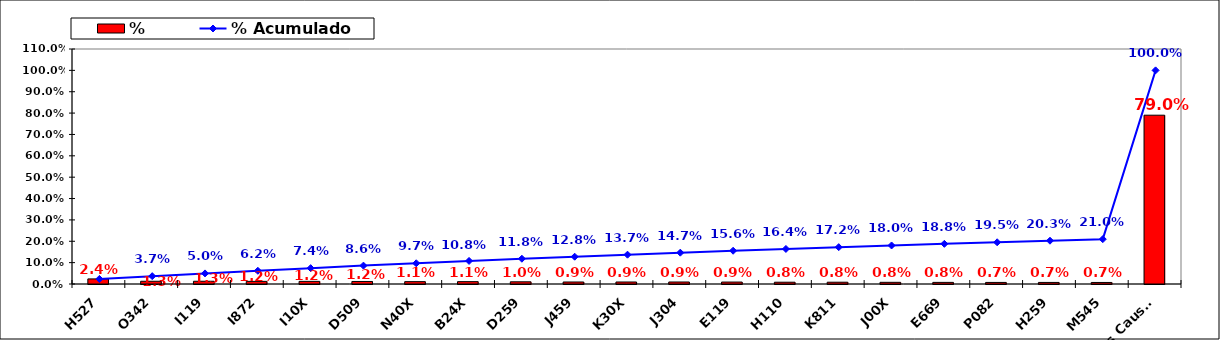
| Category | % |
|---|---|
| H527 | 0.024 |
| O342 | 0.013 |
| I119 | 0.013 |
| I872 | 0.012 |
| I10X | 0.012 |
| D509 | 0.012 |
| N40X | 0.011 |
| B24X | 0.011 |
| D259 | 0.01 |
| J459 | 0.009 |
| K30X | 0.009 |
| J304 | 0.009 |
| E119 | 0.009 |
| H110 | 0.008 |
| K811 | 0.008 |
| J00X | 0.008 |
| E669 | 0.008 |
| P082 | 0.007 |
| H259 | 0.007 |
| M545 | 0.007 |
| Otras Causas | 0.79 |